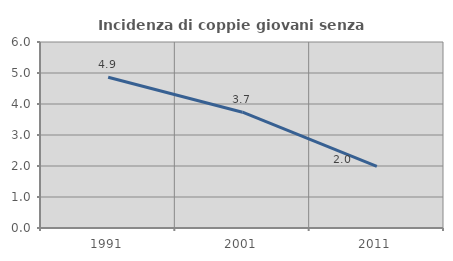
| Category | Incidenza di coppie giovani senza figli |
|---|---|
| 1991.0 | 4.861 |
| 2001.0 | 3.736 |
| 2011.0 | 1.985 |